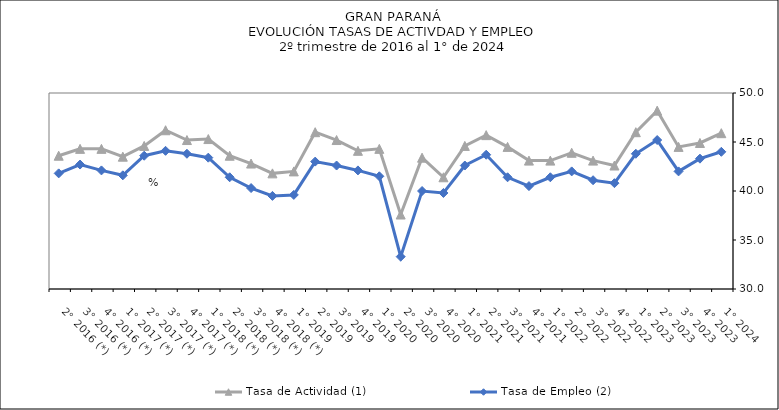
| Category | Tasa de Actividad (1) | Tasa de Empleo (2) |
|---|---|---|
| 1° 2024 | 45.9 | 44 |
| 4° 2023 | 44.9 | 43.3 |
| 3° 2023 | 44.5 | 42 |
| 2° 2023 | 48.2 | 45.2 |
| 1° 2023 | 46 | 43.8 |
| 4° 2022 | 42.6 | 40.8 |
| 3° 2022 | 43.1 | 41.1 |
| 2° 2022 | 43.9 | 42 |
| 1° 2022 | 43.1 | 41.4 |
| 4° 2021 | 43.1 | 40.5 |
| 3° 2021 | 44.5 | 41.4 |
| 2° 2021 | 45.7 | 43.7 |
| 1° 2021 | 44.6 | 42.6 |
| 4° 2020 | 41.4 | 39.8 |
| 3° 2020 | 43.4 | 40 |
| 2° 2020 | 37.6 | 33.3 |
| 1° 2020 | 44.3 | 41.5 |
| 4° 2019 | 44.1 | 42.1 |
| 3° 2019 | 45.2 | 42.6 |
| 2° 2019 | 46 | 43 |
| 1° 2019 | 42 | 39.6 |
| 4° 2018 (*) | 41.8 | 39.5 |
| 3° 2018 (*) | 42.8 | 40.3 |
| 2° 2018 (*) | 43.6 | 41.4 |
| 1° 2018 (*) | 45.3 | 43.4 |
| 4° 2017 (*) | 45.2 | 43.8 |
| 3° 2017 (*) | 46.2 | 44.1 |
| 2° 2017 (*) | 44.6 | 43.6 |
| 1° 2017 (*) | 43.5 | 41.6 |
| 4° 2016 (*) | 44.3 | 42.1 |
| 3° 2016 (*) | 44.3 | 42.7 |
| 2° 2016 (*) | 43.6 | 41.8 |